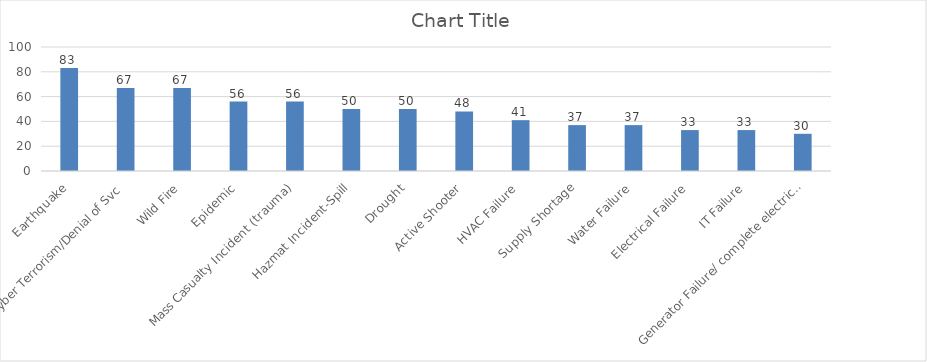
| Category | Series 0 |
|---|---|
| Earthquake | 83 |
| Cyber Terrorism/Denial of Svc | 67 |
| Wild Fire | 67 |
| Epidemic | 56 |
| Mass Casualty Incident (trauma) | 56 |
| Hazmat Incident-Spill | 50 |
| Drought | 50 |
| Active Shooter | 48 |
| HVAC Failure | 41 |
| Supply Shortage | 37 |
| Water Failure | 37 |
| Electrical Failure | 33 |
| IT Failure | 33 |
| Generator Failure/ complete electrical failure | 30 |